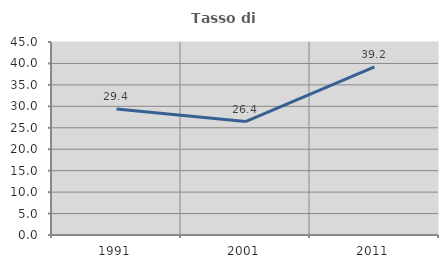
| Category | Tasso di occupazione   |
|---|---|
| 1991.0 | 29.372 |
| 2001.0 | 26.448 |
| 2011.0 | 39.199 |